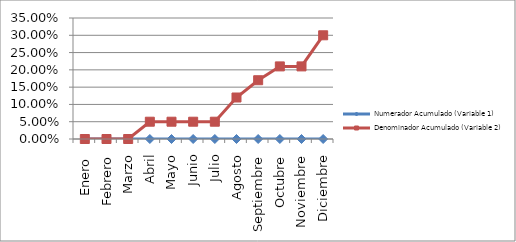
| Category | Numerador Acumulado (Variable 1) | Denominador Acumulado (Variable 2) |
|---|---|---|
| Enero  | 0 | 0 |
| Febrero | 0 | 0 |
| Marzo | 0 | 0 |
| Abril | 0 | 0.05 |
| Mayo | 0 | 0.05 |
| Junio | 0 | 0.05 |
| Julio | 0 | 0.05 |
| Agosto | 0 | 0.12 |
| Septiembre | 0 | 0.17 |
| Octubre | 0 | 0.21 |
| Noviembre | 0 | 0.21 |
| Diciembre | 0 | 0.3 |